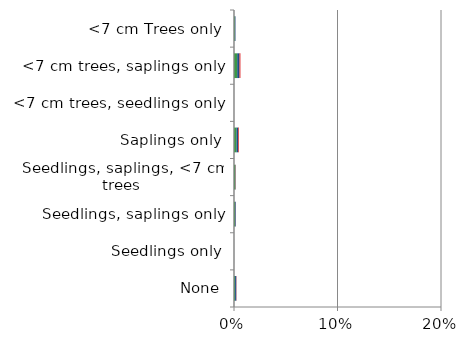
| Category | England | Scotland | Wales |
|---|---|---|---|
| None | 0.001 | 0.001 | 0 |
| Seedlings only | 0 | 0 | 0 |
| Seedlings, saplings only | 0.001 | 0.001 | 0 |
| Seedlings, saplings, <7 cm trees | 0.001 | 0 | 0 |
| Saplings only | 0.002 | 0.002 | 0.001 |
| <7 cm trees, seedlings only | 0 | 0 | 0 |
| <7 cm trees, saplings only | 0.003 | 0.002 | 0.001 |
| <7 cm Trees only | 0.001 | 0.001 | 0 |